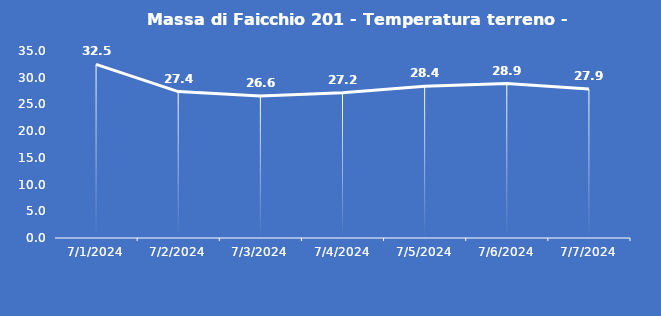
| Category | Massa di Faicchio 201 - Temperatura terreno - Grezzo (°C) |
|---|---|
| 7/1/24 | 32.5 |
| 7/2/24 | 27.4 |
| 7/3/24 | 26.6 |
| 7/4/24 | 27.2 |
| 7/5/24 | 28.4 |
| 7/6/24 | 28.9 |
| 7/7/24 | 27.9 |